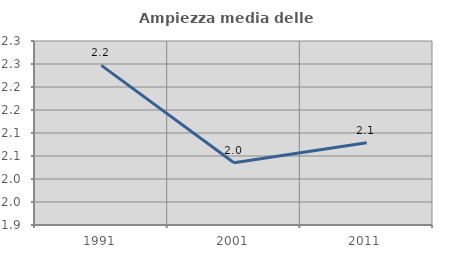
| Category | Ampiezza media delle famiglie |
|---|---|
| 1991.0 | 2.247 |
| 2001.0 | 2.035 |
| 2011.0 | 2.079 |